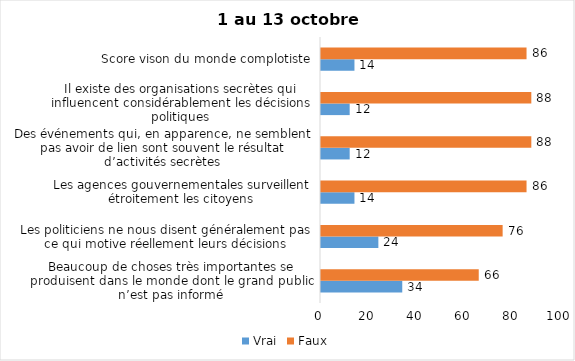
| Category | Vrai | Faux |
|---|---|---|
| Beaucoup de choses très importantes se produisent dans le monde dont le grand public n’est pas informé | 34 | 66 |
| Les politiciens ne nous disent généralement pas ce qui motive réellement leurs décisions | 24 | 76 |
| Les agences gouvernementales surveillent étroitement les citoyens | 14 | 86 |
| Des événements qui, en apparence, ne semblent pas avoir de lien sont souvent le résultat d’activités secrètes | 12 | 88 |
| Il existe des organisations secrètes qui influencent considérablement les décisions politiques | 12 | 88 |
| Score vison du monde complotiste | 14 | 86 |